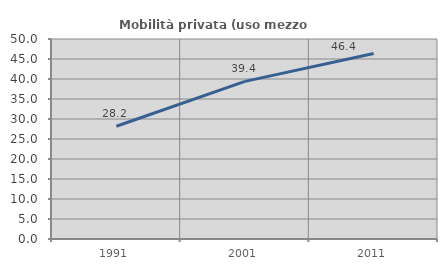
| Category | Mobilità privata (uso mezzo privato) |
|---|---|
| 1991.0 | 28.194 |
| 2001.0 | 39.407 |
| 2011.0 | 46.377 |